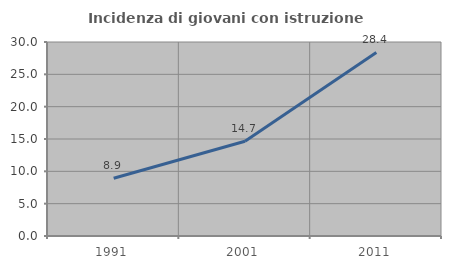
| Category | Incidenza di giovani con istruzione universitaria |
|---|---|
| 1991.0 | 8.94 |
| 2001.0 | 14.658 |
| 2011.0 | 28.385 |